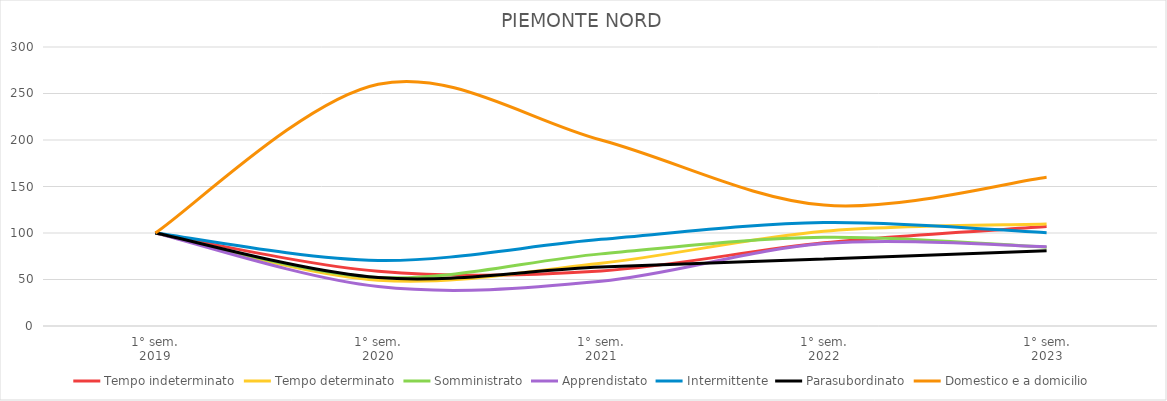
| Category | Tempo indeterminato | Tempo determinato | Somministrato | Apprendistato | Intermittente | Parasubordinato | Domestico e a domicilio |
|---|---|---|---|---|---|---|---|
| 1° sem.
2019 | 100 | 100 | 100 | 100 | 100 | 100 | 100 |
| 1° sem.
2020 | 58.837 | 49.264 | 52.204 | 42.361 | 70.503 | 52.055 | 260 |
| 1° sem.
2021 | 59.186 | 67.569 | 77.548 | 48.056 | 93.166 | 63.356 | 200 |
| 1° sem.
2022 | 89.535 | 101.875 | 95.455 | 88.611 | 111.331 | 71.918 | 130 |
| 1° sem.
2023 | 106.86 | 109.667 | 84.711 | 85.278 | 100.207 | 80.993 | 160 |